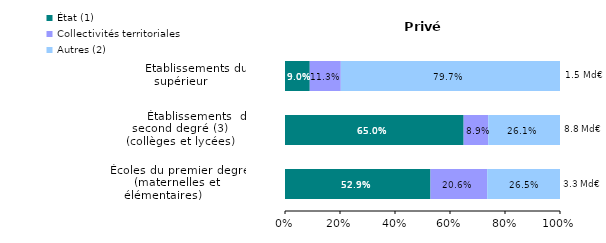
| Category | État (1) | Collectivités territoriales | Autres (2) |
|---|---|---|---|
| Écoles du premier degré
(maternelles et élémentaires)         | 0.529 | 0.206 | 0.265 |
|          Établissements  du second degré (3)
(collèges et lycées) | 0.65 | 0.089 | 0.261 |
| Établissements du supérieur          | 0.09 | 0.113 | 0.797 |